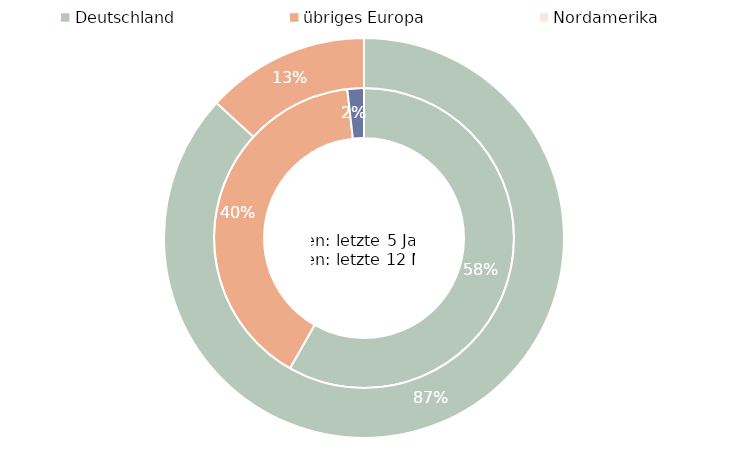
| Category | letzte 5 Jahre | letzte 12 Monate |
|---|---|---|
| Deutschland | 1448617905.596 | 0.868 |
| übriges Europa | 995104001.752 | 0.132 |
| Nordamerika | 44207086.064 | 0 |